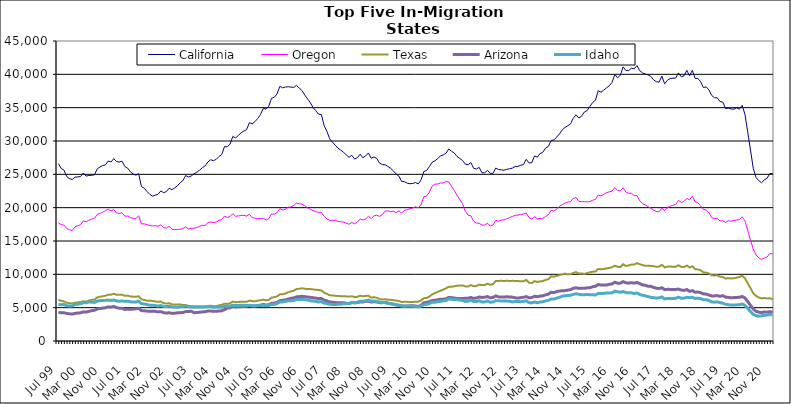
| Category | California | Oregon | Texas | Arizona | Idaho |
|---|---|---|---|---|---|
| Jul 99 | 26605 | 17749 | 6209 | 4339 | 5471 |
| Aug 99 | 25882 | 17447 | 6022 | 4228 | 5444 |
| Sep 99 | 25644 | 17401 | 5941 | 4237 | 5488 |
| Oct 99 | 24669 | 16875 | 5751 | 4134 | 5279 |
| Nov 99 | 24353 | 16701 | 5680 | 4073 | 5260 |
| Dec 99 | 24218 | 16570 | 5619 | 4042 | 5269 |
| Jan 00 | 24574 | 17109 | 5736 | 4142 | 5485 |
| Feb 00 | 24620 | 17295 | 5789 | 4192 | 5530 |
| Mar 00 | 24655 | 17436 | 5826 | 4226 | 5590 |
| Apr 00 | 25195 | 18009 | 5980 | 4375 | 5748 |
| May 00 | 24730 | 17875 | 5897 | 4337 | 5729 |
| Jun 00 | 24825 | 18113 | 6070 | 4444 | 5853 |
| Jul 00 | 24857 | 18294 | 6163 | 4555 | 5824 |
| Aug 00 | 24913 | 18376 | 6199 | 4603 | 5788 |
| Sep 00 | 25792 | 18971 | 6529 | 4804 | 5976 |
| Oct 00 | 26106 | 19135 | 6643 | 4870 | 6058 |
| Nov 00 | 26315 | 19306 | 6705 | 4926 | 6085 |
| Dec 00 | 26415 | 19570 | 6793 | 4991 | 6096 |
| Jan 01 | 26995 | 19781 | 6942 | 5122 | 6119 |
| Feb 01 | 26851 | 19519 | 6948 | 5089 | 6090 |
| Mar 01 | 27352 | 19720 | 7080 | 5180 | 6143 |
| Apr 01 | 26918 | 19221 | 6943 | 5020 | 6020 |
| May 01 | 26848 | 19126 | 6924 | 4899 | 5950 |
| Jun 01 | 26974 | 19241 | 6959 | 4895 | 6019 |
| Jul 01 | 26172 | 18725 | 6778 | 4737 | 5951 |
| Aug 01 | 25943 | 18736 | 6810 | 4757 | 5973 |
| Sep 01 | 25399 | 18514 | 6688 | 4753 | 5895 |
| Oct 01 | 25050 | 18415 | 6650 | 4780 | 5833 |
| Nov 01 | 24873 | 18381 | 6631 | 4826 | 5850 |
| Dec 01 | 25099 | 18765 | 6708 | 4898 | 5969 |
| Jan 02 | 23158 | 17561 | 6261 | 4560 | 5595 |
| Feb 02 | 22926 | 17573 | 6162 | 4531 | 5560 |
| Mar 02 | 22433 | 17452 | 6052 | 4481 | 5458 |
| Apr 02 | 22012 | 17314 | 6046 | 4458 | 5380 |
| May 02 | 21733 | 17267 | 6007 | 4452 | 5358 |
| Jun 02 | 21876 | 17298 | 5933 | 4444 | 5315 |
| Jul 02 | 21997 | 17209 | 5873 | 4383 | 5243 |
| Aug 02 | 22507 | 17436 | 5929 | 4407 | 5315 |
| Sep 02 | 22244 | 17010 | 5672 | 4248 | 5192 |
| Oct 02 | 22406 | 16952 | 5625 | 4191 | 5167 |
| Nov 02 | 22922 | 17223 | 5663 | 4242 | 5221 |
| Dec 02 | 22693 | 16770 | 5499 | 4142 | 5120 |
| Jan 03 | 22964 | 16694 | 5463 | 4166 | 5089 |
| Feb 03 | 23276 | 16727 | 5461 | 4226 | 5077 |
| Mar 03 | 23736 | 16766 | 5486 | 4251 | 5145 |
| Apr 03 | 24079 | 16859 | 5389 | 4289 | 5145 |
| May 03 | 24821 | 17117 | 5378 | 4415 | 5254 |
| Jun 03 | 24592 | 16812 | 5273 | 4426 | 5135 |
| Jul 03 | 24754 | 16875 | 5226 | 4466 | 5124 |
| Aug 03 | 25092 | 16922 | 5181 | 4244 | 5100 |
| Sep 03 | 25316 | 17036 | 5181 | 4279 | 5086 |
| Oct 03 | 25622 | 17228 | 5139 | 4301 | 5110 |
| Nov 03 | 25984 | 17335 | 5175 | 4362 | 5091 |
| Dec 03 | 26269 | 17350 | 5189 | 4396 | 5113 |
| Jan 04 | 26852 | 17734 | 5255 | 4492 | 5152 |
| Feb 04 | 27184 | 17860 | 5301 | 4502 | 5183 |
| Mar 04 | 27062 | 17757 | 5227 | 4443 | 5056 |
| Apr 04 | 27238 | 17840 | 5227 | 4461 | 5104 |
| May 04 | 27671 | 18113 | 5345 | 4493 | 5095 |
| Jun 04 | 27949 | 18201 | 5416 | 4532 | 5103 |
| Jul 04 | 29172 | 18727 | 5597 | 4697 | 5231 |
| Aug 04 | 29122 | 18529 | 5561 | 4945 | 5197 |
| Sep 04 | 29542 | 18678 | 5656 | 4976 | 5237 |
| Oct 04 | 30674 | 19108 | 5922 | 5188 | 5363 |
| Nov 04 | 30472 | 18716 | 5823 | 5106 | 5321 |
| Dec 04 | 30831 | 18755 | 5838 | 5135 | 5312 |
| Jan 05 | 31224 | 18823 | 5906 | 5155 | 5374 |
| Feb 05 | 31495 | 18842 | 5898 | 5168 | 5357 |
| Mar 05 | 31714 | 18738 | 5894 | 5212 | 5313 |
| Apr 05 | 32750 | 18998 | 6060 | 5340 | 5350 |
| May 05 | 32575 | 18504 | 5989 | 5269 | 5276 |
| Jun 05 | 32898 | 18414 | 5954 | 5252 | 5271 |
| Jul 05 | 33384 | 18395 | 6062 | 5322 | 5322 |
| Aug 05 | 33964 | 18381 | 6113 | 5375 | 5316 |
| Sep 05 | 34897 | 18426 | 6206 | 5493 | 5362 |
| Oct 05 | 34780 | 18132 | 6100 | 5408 | 5308 |
| Nov 05 | 35223 | 18332 | 6162 | 5434 | 5314 |
| Dec 05 | 36415 | 19047 | 6508 | 5658 | 5487 |
| Jan 06 | 36567 | 19032 | 6576 | 5688 | 5480 |
| Feb 06 | 37074 | 19257 | 6692 | 5792 | 5616 |
| Mar 06 | 38207 | 19845 | 6993 | 6052 | 5850 |
| Apr 06 | 37976 | 19637 | 7024 | 6101 | 5864 |
| May 06 | 38099 | 19781 | 7114 | 6178 | 5943 |
| Jun 06 | 38141 | 20061 | 7331 | 6276 | 6018 |
| Jul 06 | 38097 | 20111 | 7431 | 6399 | 6046 |
| Aug 06 | 38021 | 20333 | 7542 | 6450 | 6064 |
| Sep 06 | 38349 | 20686 | 7798 | 6627 | 6232 |
| Oct 06 | 37947 | 20591 | 7825 | 6647 | 6216 |
| Nov 06 | 37565 | 20526 | 7907 | 6707 | 6244 |
| Dec 06 | 36884 | 20272 | 7840 | 6648 | 6192 |
| Jan 07 | 36321 | 19984 | 7789 | 6597 | 6151 |
| Feb 07 | 35752 | 19752 | 7799 | 6554 | 6048 |
| Mar 07 | 35025 | 19547 | 7737 | 6487 | 5989 |
| Apr 07 | 34534 | 19412 | 7685 | 6430 | 5937 |
| May 07 | 34022 | 19296 | 7654 | 6353 | 5858 |
| Jun 07 | 33974 | 19318 | 7577 | 6390 | 5886 |
| Jul 07 | 32298 | 18677 | 7250 | 6117 | 5682 |
| Aug 07 | 31436 | 18322 | 7070 | 6034 | 5617 |
| Sep 07 | 30331 | 18087 | 6853 | 5847 | 5500 |
| Oct 07 | 29813 | 18108 | 6839 | 5821 | 5489 |
| Nov 07 | 29384 | 18105 | 6777 | 5769 | 5481 |
| Dec 07 | 28923 | 17949 | 6760 | 5733 | 5499 |
| Jan 08 | 28627 | 17890 | 6721 | 5732 | 5521 |
| Feb 08 | 28328 | 17834 | 6719 | 5749 | 5579 |
| Mar 08 | 27911 | 17680 | 6690 | 5650 | 5614 |
| Apr 08 | 27543 | 17512 | 6656 | 5612 | 5635 |
| May 08 | 27856 | 17754 | 6705 | 5774 | 5798 |
| Jun 08 | 27287 | 17589 | 6593 | 5717 | 5745 |
| Jul 08 | 27495 | 17834 | 6623 | 5761 | 5807 |
| Aug 08 | 28018 | 18309 | 6789 | 5867 | 5982 |
| Sep-08 | 27491 | 18164 | 6708 | 5864 | 5954 |
| Oct 08 | 27771 | 18291 | 6755 | 5942 | 6032 |
| Nov 08 | 28206 | 18706 | 6787 | 5970 | 6150 |
| Dec 08 | 27408 | 18353 | 6505 | 5832 | 5975 |
| Jan 09 | 27601 | 18778 | 6569 | 5890 | 5995 |
| Feb 09 | 27394 | 18863 | 6483 | 5845 | 5936 |
| Mar 09 | 26690 | 18694 | 6273 | 5751 | 5806 |
| Apr 09 | 26461 | 18943 | 6222 | 5735 | 5777 |
| May 09 | 26435 | 19470 | 6272 | 5819 | 5767 |
| Jun 09 | 26187 | 19522 | 6199 | 5700 | 5649 |
| Jul 09 | 25906 | 19408 | 6171 | 5603 | 5617 |
| Aug 09 | 25525 | 19469 | 6128 | 5533 | 5540 |
| Sep 09 | 25050 | 19249 | 6059 | 5405 | 5437 |
| Oct 09 | 24741 | 19529 | 6004 | 5349 | 5369 |
| Nov 09 | 23928 | 19187 | 5854 | 5271 | 5248 |
| Dec 09 | 23899 | 19607 | 5886 | 5261 | 5195 |
| Jan 10 | 23676 | 19703 | 5881 | 5232 | 5234 |
| Feb 10 | 23592 | 19845 | 5850 | 5272 | 5236 |
| Mar 10 | 23634 | 19946 | 5864 | 5278 | 5219 |
| Apr 10 | 23774 | 20134 | 5889 | 5257 | 5201 |
| May 10 | 23567 | 19966 | 5897 | 5172 | 5105 |
| Jun 10 | 24166 | 20464 | 6087 | 5356 | 5237 |
| Jul 10 | 25410 | 21627 | 6417 | 5742 | 5452 |
| Aug 10 | 25586 | 21744 | 6465 | 5797 | 5491 |
| Sep 10 | 26150 | 22314 | 6667 | 5907 | 5609 |
| Oct 10 | 26807 | 23219 | 6986 | 6070 | 5831 |
| Nov 10 | 27033 | 23520 | 7179 | 6100 | 5810 |
| Dec 10 | 27332 | 23551 | 7361 | 6182 | 5898 |
| Jan 11 | 27769 | 23697 | 7525 | 6276 | 5938 |
| Feb 11 | 27898 | 23718 | 7708 | 6267 | 6016 |
| Mar 11 | 28155 | 23921 | 7890 | 6330 | 6081 |
| Apr 11 | 28790 | 23847 | 8146 | 6544 | 6305 |
| May 11 | 28471 | 23215 | 8131 | 6502 | 6248 |
| Jun 11 | 28191 | 22580 | 8199 | 6445 | 6217 |
| Jul 11 | 27678 | 21867 | 8291 | 6368 | 6202 |
| Aug 11 | 27372 | 21203 | 8321 | 6356 | 6146 |
| Sep 11 | 27082 | 20570 | 8341 | 6387 | 6075 |
| Oct 11 | 26528 | 19442 | 8191 | 6402 | 5932 |
| Nov 11 | 26440 | 18872 | 8176 | 6426 | 5968 |
| Dec 11 | 26770 | 18784 | 8401 | 6533 | 6106 |
| Jan 12 | 25901 | 17963 | 8202 | 6390 | 5933 |
| Feb 12 | 25796 | 17718 | 8266 | 6456 | 5900 |
| Mar 12 | 26042 | 17647 | 8456 | 6600 | 6054 |
| Apr 12 | 25239 | 17386 | 8388 | 6534 | 5838 |
| May 12 | 25238 | 17407 | 8401 | 6558 | 5854 |
| Jun 12 | 25593 | 17673 | 8594 | 6669 | 6009 |
| Jul 12 | 25155 | 17237 | 8432 | 6474 | 5817 |
| Aug 12 | 25146 | 17391 | 8536 | 6539 | 5842 |
| Sep 12 | 25942 | 18102 | 8989 | 6759 | 6061 |
| Oct 12 | 25718 | 17953 | 9012 | 6618 | 6027 |
| Nov 12 | 25677 | 18134 | 9032 | 6611 | 6009 |
| Dec 12 | 25619 | 18166 | 8981 | 6601 | 5999 |
| Jan 13 | 25757 | 18344 | 9051 | 6627 | 5989 |
| Feb-13 | 25830 | 18512 | 9001 | 6606 | 5968 |
| Mar-13 | 25940 | 18689 | 9021 | 6577 | 5853 |
| Apr 13 | 26187 | 18844 | 9013 | 6478 | 5925 |
| May 13 | 26192 | 18884 | 9003 | 6431 | 5924 |
| Jun-13 | 26362 | 19013 | 8948 | 6508 | 5896 |
| Jul 13 | 26467 | 19037 | 8958 | 6559 | 5948 |
| Aug 13 | 27253 | 19198 | 9174 | 6655 | 6020 |
| Sep 13 | 26711 | 18501 | 8747 | 6489 | 5775 |
| Oct 13 | 26733 | 18301 | 8681 | 6511 | 5711 |
| Nov 13 | 27767 | 18620 | 8989 | 6709 | 5860 |
| Dec 13 | 27583 | 18320 | 8863 | 6637 | 5740 |
| Jan 14 | 28107 | 18409 | 8939 | 6735 | 5843 |
| Feb-14 | 28313 | 18383 | 8989 | 6779 | 5893 |
| Mar 14 | 28934 | 18696 | 9160 | 6918 | 6015 |
| Apr 14 | 29192 | 18946 | 9291 | 7036 | 6099 |
| May 14 | 30069 | 19603 | 9701 | 7314 | 6304 |
| Jun 14 | 30163 | 19487 | 9641 | 7252 | 6293 |
| Jul-14 | 30587 | 19754 | 9752 | 7415 | 6427 |
| Aug-14 | 31074 | 20201 | 9882 | 7499 | 6557 |
| Sep 14 | 31656 | 20459 | 9997 | 7536 | 6719 |
| Oct 14 | 32037 | 20663 | 10109 | 7555 | 6786 |
| Nov 14 | 32278 | 20825 | 9992 | 7628 | 6831 |
| Dec 14 | 32578 | 20918 | 10006 | 7705 | 6860 |
| Jan 15 | 33414 | 21396 | 10213 | 7906 | 7000 |
| Feb 15 | 33922 | 21518 | 10337 | 7982 | 7083 |
| Mar 15 | 33447 | 20942 | 10122 | 7891 | 7006 |
| Apr-15 | 33731 | 20893 | 10138 | 7906 | 6931 |
| May 15 | 34343 | 20902 | 10053 | 7895 | 6952 |
| Jun-15 | 34572 | 20870 | 10192 | 7973 | 6966 |
| Jul 15 | 35185 | 20916 | 10303 | 8000 | 6949 |
| Aug 15 | 35780 | 21115 | 10399 | 8126 | 6938 |
| Sep 15 | 36109 | 21246 | 10428 | 8207 | 6896 |
| Oct 15 | 37555 | 21908 | 10813 | 8477 | 7140 |
| Nov 15 | 37319 | 21750 | 10763 | 8390 | 7112 |
| Dec 15 | 37624 | 21990 | 10807 | 8395 | 7149 |
| Jan 16 | 37978 | 22248 | 10892 | 8388 | 7201 |
| Feb 16 | 38285 | 22369 | 10951 | 8508 | 7192 |
| Mar 16 | 38792 | 22506 | 11075 | 8547 | 7226 |
| Apr 16 | 39994 | 22999 | 11286 | 8815 | 7487 |
| May 16 | 39488 | 22548 | 11132 | 8673 | 7382 |
| Jun 16 | 39864 | 22556 | 11100 | 8682 | 7315 |
| Jul 16 | 41123 | 22989 | 11516 | 8903 | 7420 |
| Aug 16 | 40573 | 22333 | 11251 | 8731 | 7261 |
| Sep 16 | 40560 | 22162 | 11340 | 8692 | 7216 |
| Oct 16 | 40923 | 22172 | 11456 | 8742 | 7233 |
| Nov 16 | 40817 | 21818 | 11459 | 8685 | 7101 |
| Dec 16 | 41311 | 21815 | 11681 | 8783 | 7203 |
| Jan 17 | 40543 | 21029 | 11524 | 8609 | 6982 |
| Feb 17 | 40218 | 20613 | 11385 | 8416 | 6852 |
| Mar 17 | 40052 | 20425 | 11276 | 8354 | 6775 |
| Apr 17 | 39913 | 20147 | 11297 | 8218 | 6653 |
| May 17 | 39695 | 19910 | 11265 | 8196 | 6552 |
| Jun 17 | 39177 | 19650 | 11225 | 8034 | 6500 |
| Jul 17 | 38901 | 19419 | 11115 | 7923 | 6429 |
| Aug 17 | 38827 | 19389 | 11168 | 7867 | 6479 |
| Sep 17 | 39736 | 19936 | 11426 | 7991 | 6609 |
| Oct 17 | 38576 | 19547 | 11041 | 7708 | 6315 |
| Nov 17 | 39108 | 20013 | 11158 | 7746 | 6381 |
| Dec 17 | 39359 | 20202 | 11185 | 7743 | 6366 |
| Jan 18 | 39420 | 20362 | 11118 | 7736 | 6380 |
| Feb 18 | 39440 | 20476 | 11128 | 7741 | 6407 |
| Mar 18 | 40218 | 21106 | 11362 | 7789 | 6578 |
| Apr 18 | 39637 | 20788 | 11111 | 7642 | 6423 |
| May 18 | 39777 | 20933 | 11097 | 7591 | 6430 |
| Jun 18 | 40602 | 21381 | 11317 | 7721 | 6554 |
| Jul 18 | 39767 | 21189 | 11038 | 7445 | 6489 |
| Aug 18 | 40608 | 21729 | 11200 | 7560 | 6569 |
| Sep 18 | 39395 | 20916 | 10772 | 7318 | 6383 |
| Oct 18 | 39383 | 20724 | 10740 | 7344 | 6429 |
| Nov 18 | 38891 | 20265 | 10605 | 7255 | 6365 |
| Dec 18 | 38013 | 19741 | 10292 | 7069 | 6205 |
| Jan 19 | 38130 | 19643 | 10261 | 7032 | 6203 |
| Feb 19 | 37658 | 19237 | 10132 | 6892 | 6073 |
| Mar 19 | 36831 | 18492 | 9848 | 6766 | 5863 |
| Apr 19 | 36492 | 18349 | 9839 | 6763 | 5827 |
| May 19 | 36481 | 18407 | 9867 | 6809 | 5873 |
| Jun 19 | 35925 | 17998 | 9661 | 6698 | 5761 |
| Jul 19 | 35843 | 18049 | 9598 | 6800 | 5673 |
| Aug 19 | 34870 | 17785 | 9361 | 6577 | 5512 |
| Sep 19 | 34945 | 18038 | 9428 | 6547 | 5437 |
| Oct 19 | 34802 | 17977 | 9385 | 6483 | 5390 |
| Nov 19 | 34775 | 18072 | 9403 | 6511 | 5401 |
| Dec 19 | 34976 | 18140 | 9518 | 6521 | 5419 |
| Jan 20 | 34774 | 18209 | 9594 | 6561 | 5434 |
| Feb 20 | 35352 | 18632 | 9804 | 6682 | 5543 |
| Mar 20 | 34013 | 18041 | 9411 | 6464 | 5330 |
| Apr 20 | 31385 | 16629 | 8666 | 5922 | 4906 |
| May 20 | 28657 | 15123 | 7927 | 5355 | 4419 |
| Jun 20 | 25915 | 13817 | 7164 | 4815 | 3992 |
| Jul 20 | 24545 | 12926 | 6776 | 4457 | 3810 |
| Aug 20 | 24048 | 12443 | 6521 | 4326 | 3720 |
| Sep 20 | 23756 | 12258 | 6386 | 4266 | 3784 |
| Oct 20 | 24166 | 12429 | 6452 | 4347 | 3861 |
| Nov 20 | 24404 | 12597 | 6386 | 4324 | 3883 |
| Dec 20 | 25120 | 13122 | 6420 | 4394 | 3974 |
| Jan 21 | 25111 | 13080 | 6236 | 4304 | 3924 |